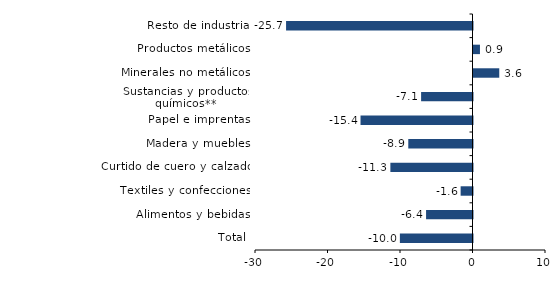
| Category | Series 0 |
|---|---|
| Total | -10.017 |
| Alimentos y bebidas | -6.404 |
| Textiles y confecciones | -1.637 |
| Curtido de cuero y calzado | -11.328 |
| Madera y muebles | -8.859 |
| Papel e imprentas | -15.445 |
| Sustancias y productos químicos** | -7.089 |
| Minerales no metálicos | 3.553 |
| Productos metálicos | 0.891 |
| Resto de industria | -25.714 |